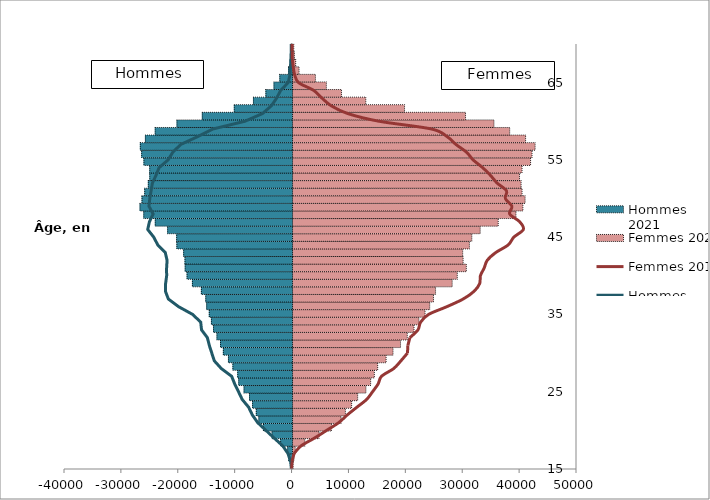
| Category | Femmes 2021 | Hommes 2021 |
|---|---|---|
| 0 | 82 | -233 |
| 1 | 232 | -583 |
| 2 | 473 | -768 |
| 3 | 2147 | -2009 |
| 4 | 4657 | -3510 |
| 5 | 6838 | -5029 |
| 6 | 8519 | -5833 |
| 7 | 9288 | -6283 |
| 8 | 10385 | -6939 |
| 9 | 11447 | -7477 |
| 10 | 12899 | -8431 |
| 11 | 13731 | -9370 |
| 12 | 14376 | -9548 |
| 13 | 14967 | -10397 |
| 14 | 16447 | -11180 |
| 15 | 17659 | -12073 |
| 16 | 18981 | -12571 |
| 17 | 20168 | -13194 |
| 18 | 21350 | -13805 |
| 19 | 22211 | -14169 |
| 20 | 23290 | -14549 |
| 21 | 24113 | -15006 |
| 22 | 24774 | -15164 |
| 23 | 25137 | -15937 |
| 24 | 28059 | -17511 |
| 25 | 28955 | -18450 |
| 26 | 30547 | -18781 |
| 27 | 29983 | -18814 |
| 28 | 29907 | -19053 |
| 29 | 31088 | -20244 |
| 30 | 31513 | -20277 |
| 31 | 32984 | -21868 |
| 32 | 36153 | -24040 |
| 33 | 39270 | -26060 |
| 34 | 40493 | -26721 |
| 35 | 40876 | -26374 |
| 36 | 40345 | -25894 |
| 37 | 40175 | -25262 |
| 38 | 39899 | -25007 |
| 39 | 40341 | -25017 |
| 40 | 41840 | -26034 |
| 41 | 42094 | -26433 |
| 42 | 42635 | -26668 |
| 43 | 40967 | -25776 |
| 44 | 38171 | -24050 |
| 45 | 35403 | -20222 |
| 46 | 30407 | -15772 |
| 47 | 19686 | -10151 |
| 48 | 12879 | -6785 |
| 49 | 8607 | -4596 |
| 50 | 5940 | -3171 |
| 51 | 4021 | -2150 |
| 52 | 1145 | -621 |
| 53 | 553 | -327 |
| 54 | 328 | -179 |
| 55 | 217 | -150 |